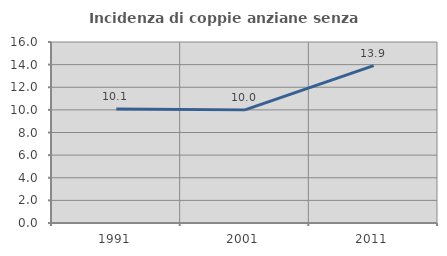
| Category | Incidenza di coppie anziane senza figli  |
|---|---|
| 1991.0 | 10.072 |
| 2001.0 | 10 |
| 2011.0 | 13.918 |